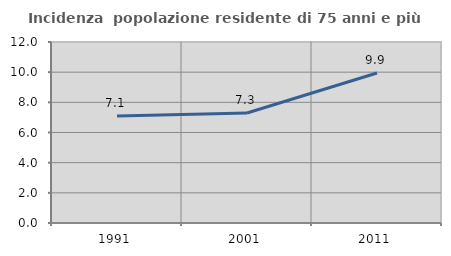
| Category | Incidenza  popolazione residente di 75 anni e più |
|---|---|
| 1991.0 | 7.098 |
| 2001.0 | 7.292 |
| 2011.0 | 9.942 |